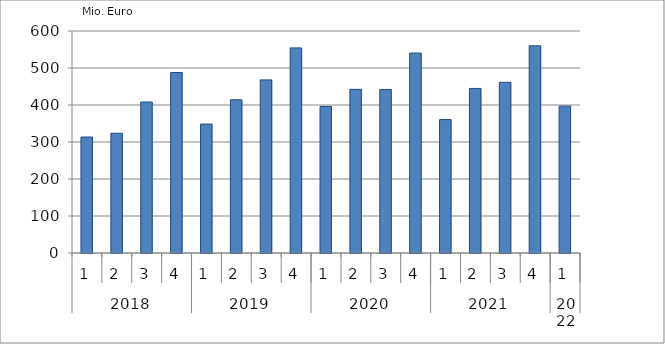
| Category | Ausbaugewerblicher Umsatz3 |
|---|---|
| 0 | 313433.569 |
| 1 | 323547.694 |
| 2 | 408057.42 |
| 3 | 487843.765 |
| 4 | 348466.115 |
| 5 | 414145.554 |
| 6 | 467849.207 |
| 7 | 554369.34 |
| 8 | 395996.128 |
| 9 | 442270.528 |
| 10 | 441987.109 |
| 11 | 540250.513 |
| 12 | 360578.959 |
| 13 | 444796.964 |
| 14 | 461290.095 |
| 15 | 559989.337 |
| 16 | 396959.135 |